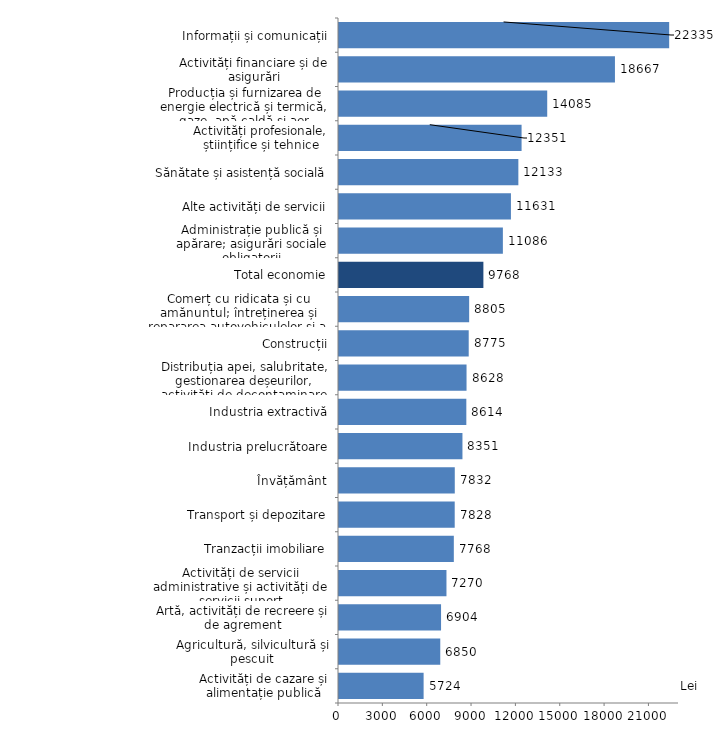
| Category | Series 0 |
|---|---|
| Activități de cazare și alimentație publică | 5723.8 |
| Agricultură, silvicultură și pescuit | 6850.4 |
| Artă, activități de recreere și de agrement | 6903.5 |
| Activități de servicii administrative și activități de servicii suport | 7269.5 |
| Tranzacții imobiliare | 7767.6 |
| Transport și depozitare | 7827.6 |
| Învățământ | 7832.2 |
| Industria prelucrătoare | 8351.1 |
| Industria extractivă | 8613.6 |
| Distribuția apei, salubritate, gestionarea deșeurilor, activități de decontaminare | 8627.7 |
| Construcții | 8774.8 |
| Comerț cu ridicata și cu amănuntul; întreținerea și repararea autovehiculelor și a motocicletelor | 8804.6 |
| Total economie | 9767.6 |
| Administrație publică și apărare; asigurări sociale obligatorii | 11085.8 |
| Alte activități de servicii | 11630.8 |
| Sănătate și asistență socială | 12132.9 |
| Activități profesionale, științifice și tehnice | 12351 |
| Producția și furnizarea de energie electrică și termică, gaze, apă caldă și aer condiționat | 14085.2 |
| Activități financiare și de asigurări | 18666.9 |
| Informații și comunicații | 22335.3 |